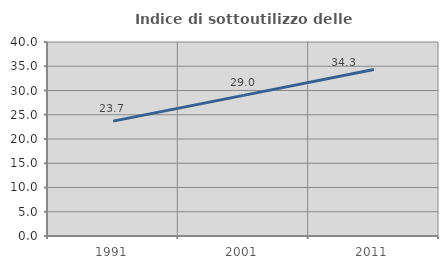
| Category | Indice di sottoutilizzo delle abitazioni  |
|---|---|
| 1991.0 | 23.684 |
| 2001.0 | 28.998 |
| 2011.0 | 34.324 |